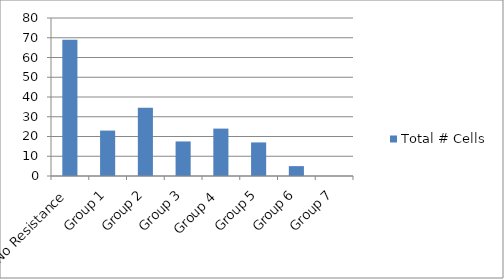
| Category | Total # Cells |
|---|---|
| No Resistance | 69 |
| Group 1 | 23 |
| Group 2 | 34.5 |
| Group 3 | 17.5 |
| Group 4  | 24 |
| Group 5 | 17 |
| Group 6 | 5 |
| Group 7 | 0 |